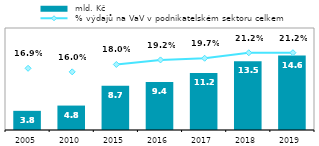
| Category |  mld. Kč |
|---|---|
| 2005 | 3.758 |
| 2010 | 4.79 |
| 2015 | 8.661 |
| 2016 | 9.421 |
| 2017 | 11.19 |
| 2018 | 13.495 |
| 2019 | 14.6 |